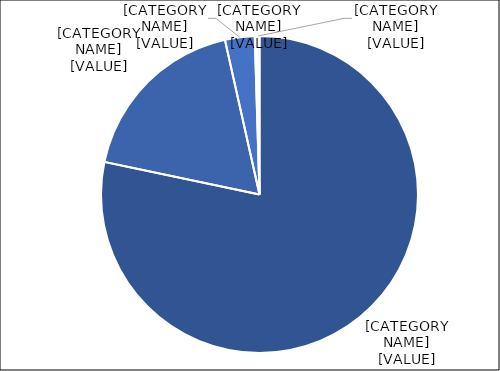
| Category | Series 0 |
|---|---|
| Physician | 78.3 |
| Midwife | 18.197 |
| Traditional Birth Attendant | 3.026 |
| Nurse | 0.208 |
| Others | 0.268 |